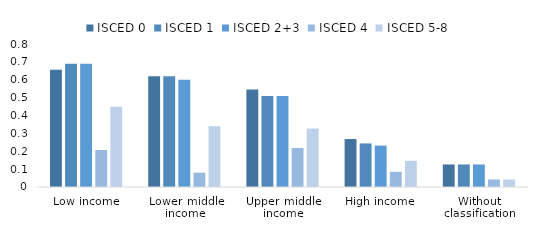
| Category | ISCED 0 | ISCED 1 | ISCED 2+3 | ISCED 4 | ISCED 5-8 |
|---|---|---|---|---|---|
| Low income | 0.656 | 0.69 | 0.69 | 0.207 | 0.448 |
| Lower middle income | 0.62 | 0.62 | 0.6 | 0.08 | 0.34 |
| Upper middle income | 0.545 | 0.509 | 0.509 | 0.218 | 0.327 |
| High income | 0.268 | 0.244 | 0.232 | 0.085 | 0.146 |
| Without classification | 0.126 | 0.126 | 0.126 | 0.042 | 0.042 |